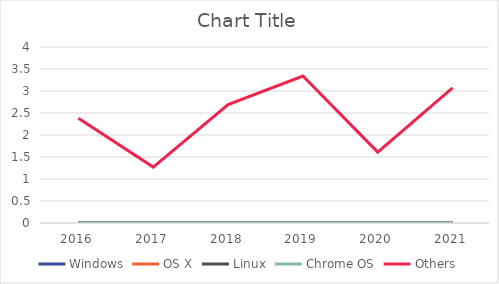
| Category | Windows | OS X | Linux | Chrome OS | Others |
|---|---|---|---|---|---|
| 2016.0 | 0 | 0 | 0 | 0 | 2.38 |
| 2017.0 | 0 | 0 | 0 | 0 | 1.27 |
| 2018.0 | 0 | 0 | 0 | 0 | 2.69 |
| 2019.0 | 0 | 0 | 0 | 0 | 3.34 |
| 2020.0 | 0 | 0 | 0 | 0 | 1.61 |
| 2021.0 | 0 | 0 | 0 | 0 | 3.07 |